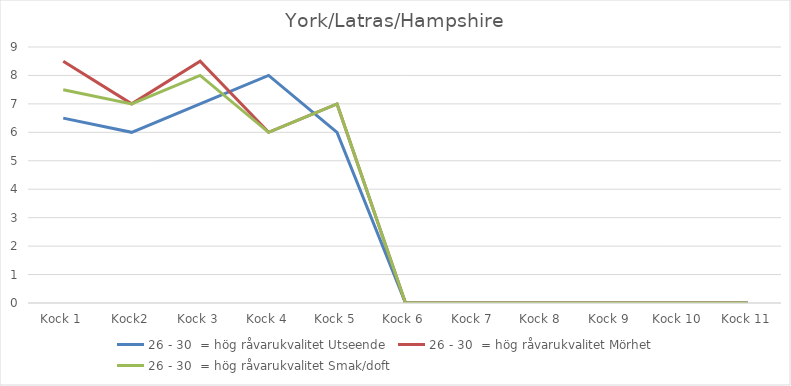
| Category | 26 - 30  = hög råvarukvalitet Utseende | 26 - 30  = hög råvarukvalitet Mörhet | 26 - 30  = hög råvarukvalitet Smak/doft |
|---|---|---|---|
| Kock 1 | 6.5 | 8.5 | 7.5 |
| Kock2 | 6 | 7 | 7 |
| Kock 3 | 7 | 8.5 | 8 |
| Kock 4 | 8 | 6 | 6 |
| Kock 5 | 6 | 7 | 7 |
| Kock 6 | 0 | 0 | 0 |
| Kock 7 | 0 | 0 | 0 |
| Kock 8 | 0 | 0 | 0 |
| Kock 9 | 0 | 0 | 0 |
| Kock 10 | 0 | 0 | 0 |
| Kock 11 | 0 | 0 | 0 |